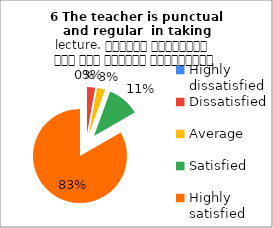
| Category | 6 The teacher is punctual and regular  in taking lecture. शिक्षक समयनिष्ठ हैं एवं नियमित व्याख्यान देते हैं |
|---|---|
| Highly dissatisfied | 0 |
| Dissatisfied | 1 |
| Average | 1 |
| Satisfied | 4 |
| Highly satisfied | 30 |